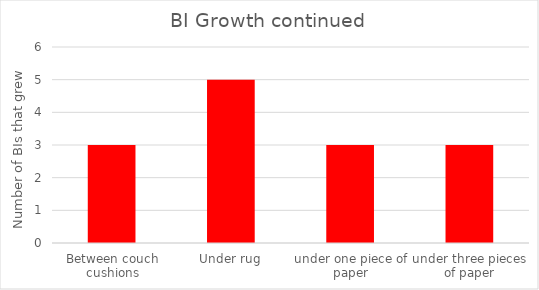
| Category | Series 0 |
|---|---|
| Between couch cushions | 3 |
| Under rug | 5 |
| under one piece of paper | 3 |
| under three pieces of paper | 3 |